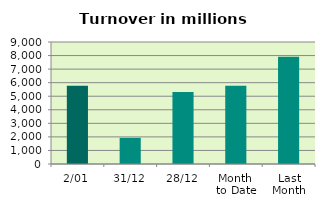
| Category | Series 0 |
|---|---|
| 2/01 | 5769.723 |
| 31/12 | 1929.942 |
| 28/12 | 5317.511 |
| Month 
to Date | 5769.723 |
| Last
Month | 7903.143 |